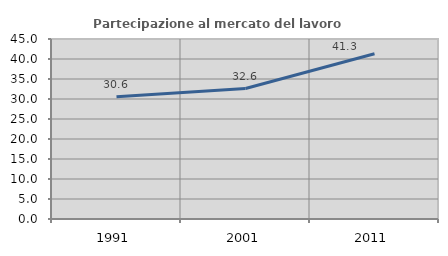
| Category | Partecipazione al mercato del lavoro  femminile |
|---|---|
| 1991.0 | 30.583 |
| 2001.0 | 32.62 |
| 2011.0 | 41.317 |